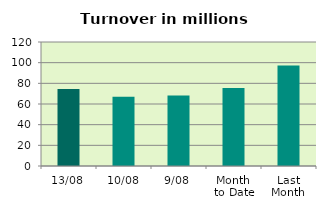
| Category | Series 0 |
|---|---|
| 13/08 | 74.524 |
| 10/08 | 66.905 |
| 9/08 | 68.332 |
| Month 
to Date | 75.598 |
| Last
Month | 97.283 |